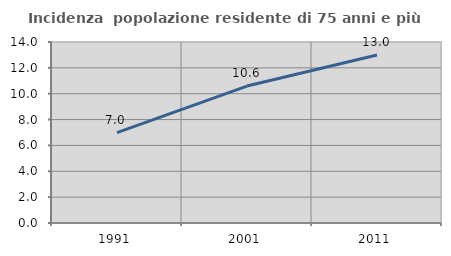
| Category | Incidenza  popolazione residente di 75 anni e più |
|---|---|
| 1991.0 | 6.988 |
| 2001.0 | 10.592 |
| 2011.0 | 12.992 |